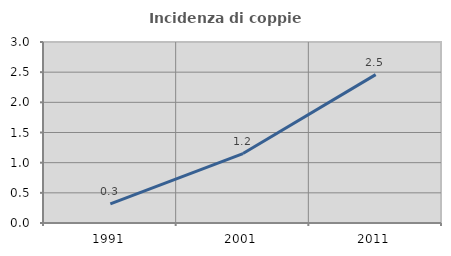
| Category | Incidenza di coppie miste |
|---|---|
| 1991.0 | 0.316 |
| 2001.0 | 1.151 |
| 2011.0 | 2.459 |